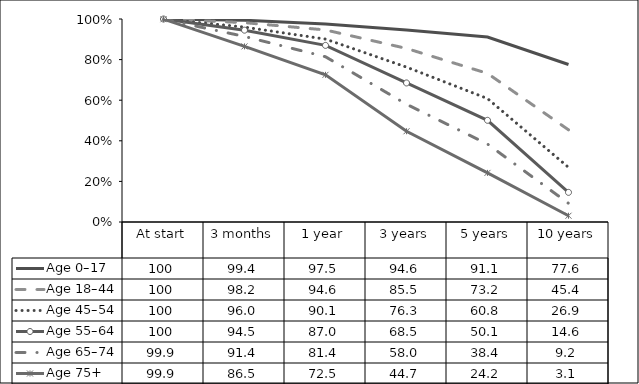
| Category | Age 0–17 | Age 18–44  | Age 45–54  | Age 55–64  | Age 65–74  | Age 75+  |
|---|---|---|---|---|---|---|
| At start | 100 | 100 | 100 | 100 | 99.9 | 99.9 |
| 3 months | 99.4 | 98.2 | 96 | 94.5 | 91.4 | 86.5 |
| 1 year | 97.5 | 94.6 | 90.1 | 87 | 81.4 | 72.5 |
| 3 years | 94.6 | 85.5 | 76.3 | 68.5 | 58 | 44.7 |
| 5 years | 91.1 | 73.2 | 60.8 | 50.1 | 38.4 | 24.2 |
| 10 years | 77.6 | 45.4 | 26.9 | 14.6 | 9.2 | 3.1 |